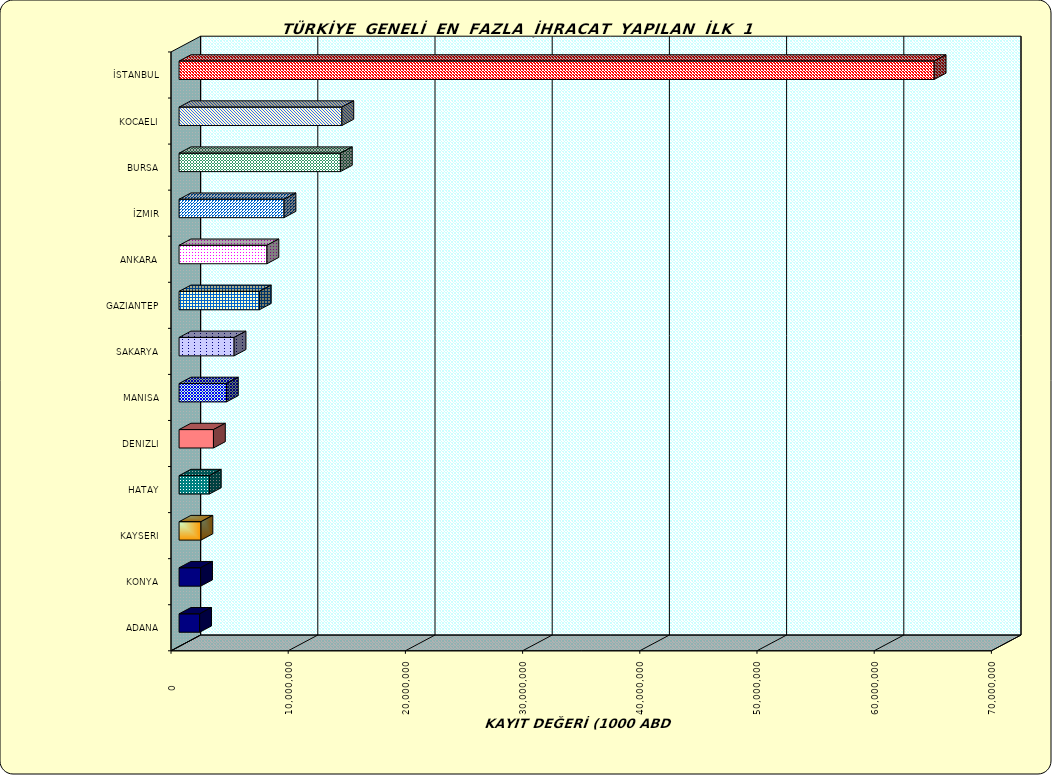
| Category | Series 0 |
|---|---|
| İSTANBUL | 64431114.239 |
| KOCAELI | 13889399.231 |
| BURSA | 13764378.793 |
| İZMIR | 8955507.453 |
| ANKARA | 7497049.824 |
| GAZIANTEP | 6849173.374 |
| SAKARYA | 4695479.808 |
| MANISA | 4040917.781 |
| DENIZLI | 2934192.419 |
| HATAY | 2582241.069 |
| KAYSERI | 1867334.667 |
| KONYA | 1838462.343 |
| ADANA | 1754640.414 |